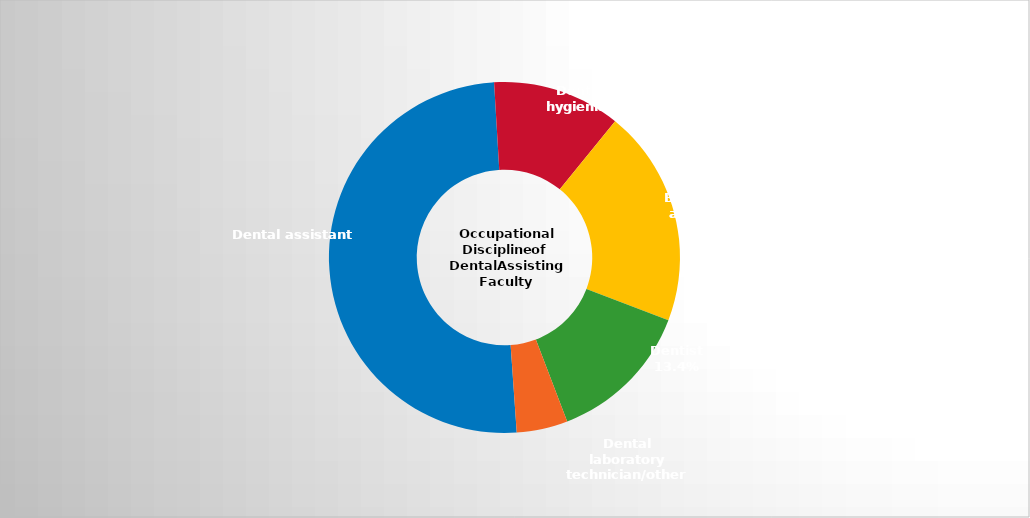
| Category | Series 2 |
|---|---|
| Dental assistant   | 0.502 |
| Dental hygienist | 0.118 |
| Both dental hygienist and dental assistant | 0.2 |
| Dentist | 0.134 |
| Dental laboratory technician/other | 0.047 |